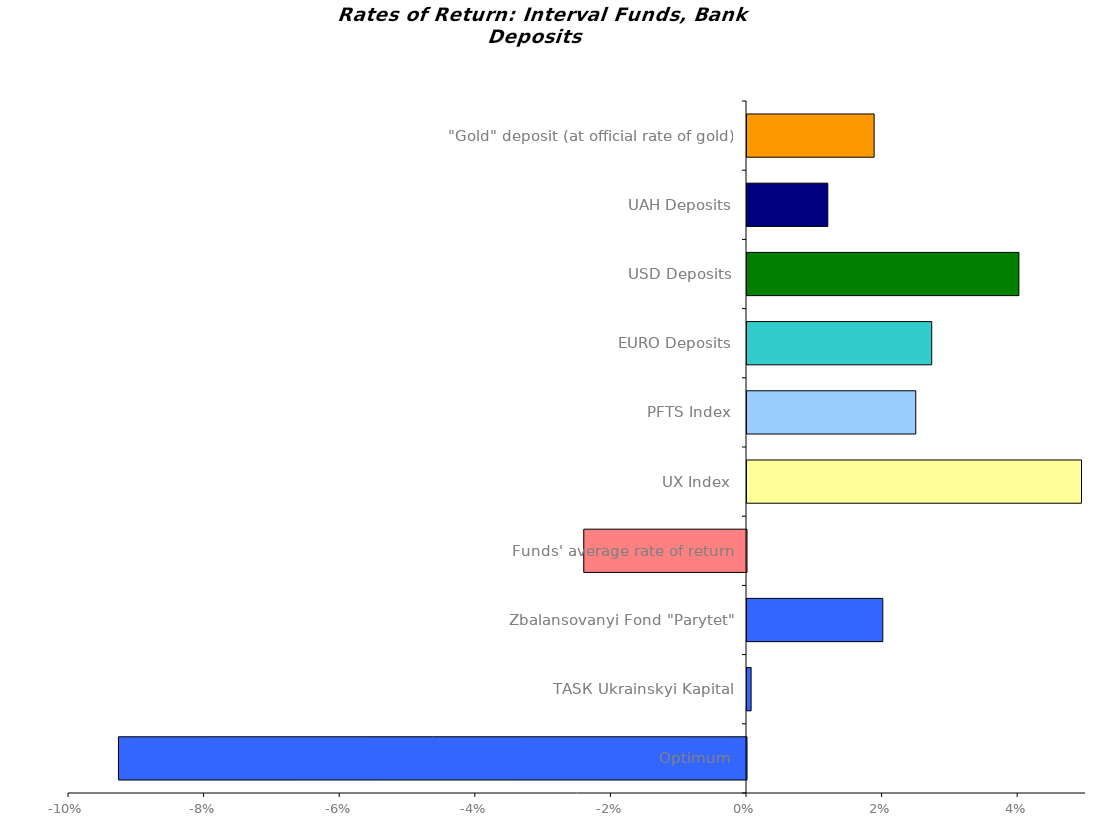
| Category | Series 0 |
|---|---|
| Optimum | -0.093 |
| ТАSК Ukrainskyi Kapital | 0.001 |
| Zbalansovanyi Fond "Parytet" | 0.02 |
| Funds' average rate of return | -0.024 |
| UX Index | 0.049 |
| PFTS Index | 0.025 |
| EURO Deposits | 0.027 |
| USD Deposits | 0.04 |
| UAH Deposits | 0.012 |
| "Gold" deposit (at official rate of gold) | 0.019 |